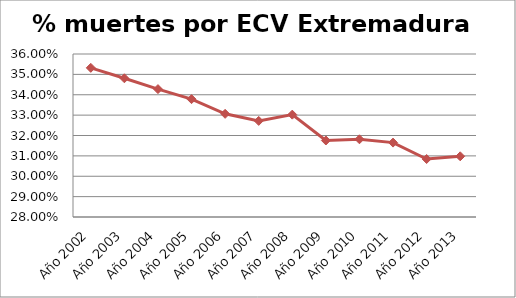
| Category | Series 0 |
|---|---|
| Año 2002 | 0.353 |
| Año 2003 | 0.348 |
| Año 2004 | 0.343 |
| Año 2005 | 0.338 |
| Año 2006 | 0.331 |
| Año 2007 | 0.327 |
| Año 2008 | 0.33 |
| Año 2009 | 0.318 |
| Año 2010 | 0.318 |
| Año 2011 | 0.317 |
| Año 2012 | 0.308 |
| Año 2013 | 0.31 |